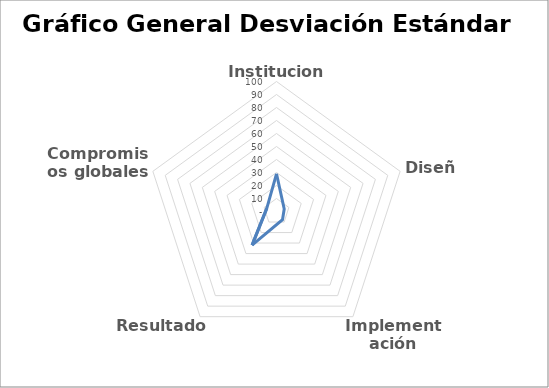
| Category | Series 0 |
|---|---|
| Institucional | 29.013 |
| Diseño | 6.242 |
| Implementación | 7.847 |
| Resultados | 31.959 |
| Compromisos globales | 7.86 |